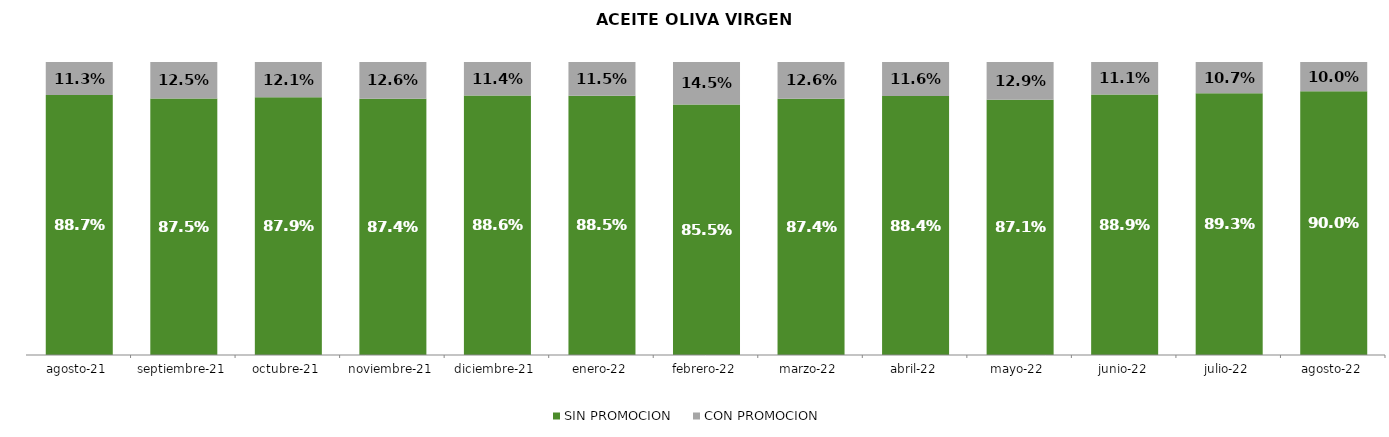
| Category | SIN PROMOCION   | CON PROMOCION   |
|---|---|---|
| 2021-08-01 | 0.887 | 0.113 |
| 2021-09-01 | 0.875 | 0.125 |
| 2021-10-01 | 0.879 | 0.121 |
| 2021-11-01 | 0.874 | 0.126 |
| 2021-12-01 | 0.886 | 0.114 |
| 2022-01-01 | 0.885 | 0.115 |
| 2022-02-01 | 0.855 | 0.145 |
| 2022-03-01 | 0.874 | 0.126 |
| 2022-04-01 | 0.884 | 0.116 |
| 2022-05-01 | 0.871 | 0.129 |
| 2022-06-01 | 0.889 | 0.111 |
| 2022-07-01 | 0.893 | 0.107 |
| 2022-08-01 | 0.9 | 0.1 |